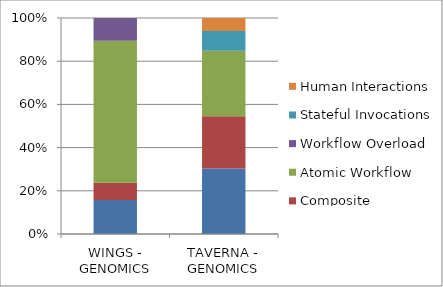
| Category | Internal macro | Composite workflows | Atomic Workflow | Workflow Overload | Stateful Invocations | Human Interactions |
|---|---|---|---|---|---|---|
| WINGS - GENOMICS | 6 | 3 | 25 | 4 | 0 | 0 |
| TAVERNA - GENOMICS | 20 | 16 | 20 | 0 | 6 | 4 |